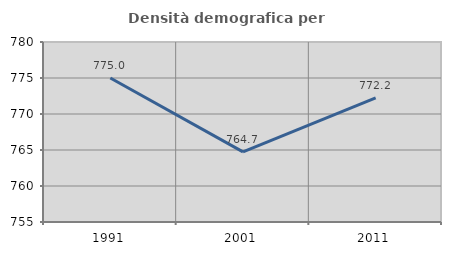
| Category | Densità demografica |
|---|---|
| 1991.0 | 775 |
| 2001.0 | 764.745 |
| 2011.0 | 772.245 |